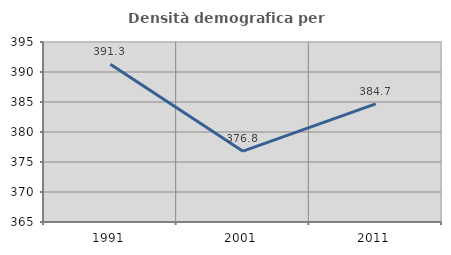
| Category | Densità demografica |
|---|---|
| 1991.0 | 391.288 |
| 2001.0 | 376.811 |
| 2011.0 | 384.7 |